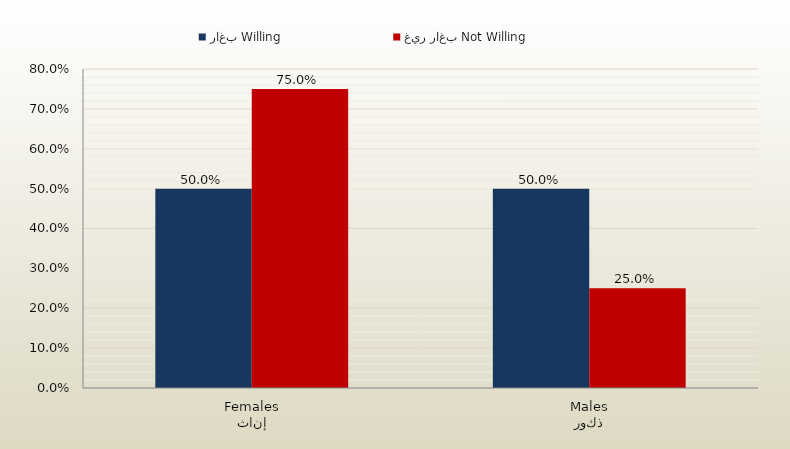
| Category | راغب Willing | غير راغب Not Willing |
|---|---|---|
| إناث
Females | 0.5 | 0.75 |
| ذكور
Males | 0.5 | 0.25 |